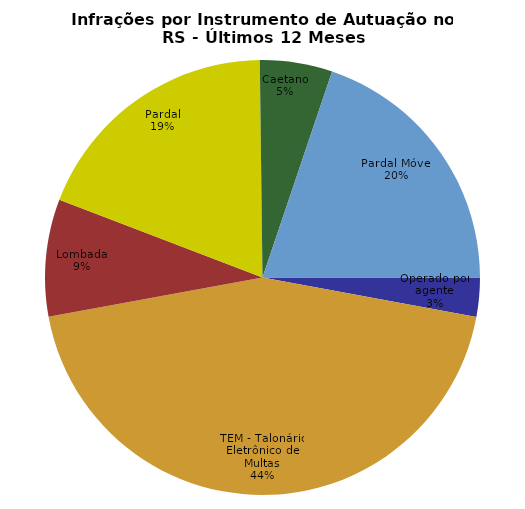
| Category | Últimos 12 Meses |
|---|---|
| Operado por agente | 60622 |
| TEM - Talonário Eletrônico de Multas | 919093 |
| Lombada | 180887 |
| Pardal | 394757 |
| Caetano | 111924 |
| Pardal Móvel | 412022 |